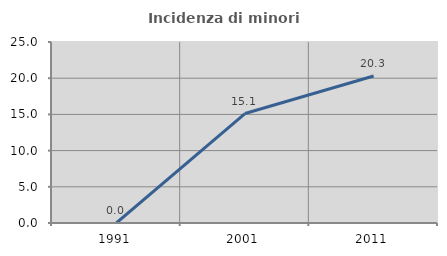
| Category | Incidenza di minori stranieri |
|---|---|
| 1991.0 | 0 |
| 2001.0 | 15.116 |
| 2011.0 | 20.312 |